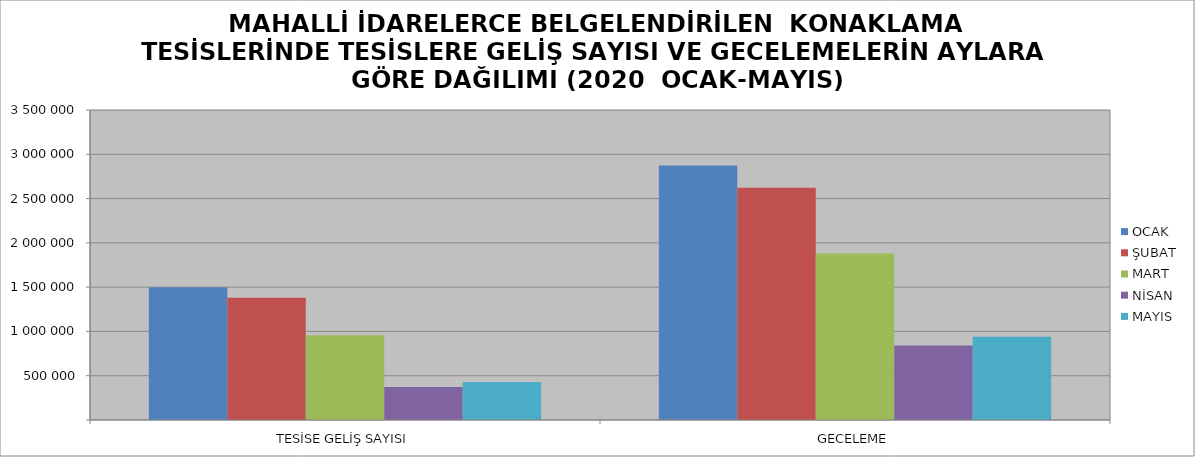
| Category | OCAK | ŞUBAT | MART | NİSAN | MAYIS |
|---|---|---|---|---|---|
| TESİSE GELİŞ SAYISI | 1497815 | 1380765 | 955554 | 372466 | 430328 |
| GECELEME | 2872303 | 2621819 | 1878971 | 839735 | 939652 |